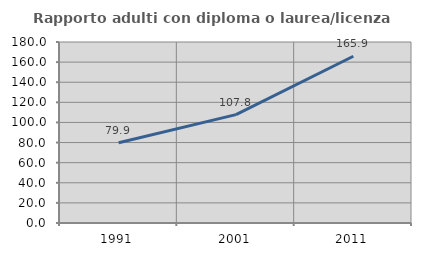
| Category | Rapporto adulti con diploma o laurea/licenza media  |
|---|---|
| 1991.0 | 79.887 |
| 2001.0 | 107.807 |
| 2011.0 | 165.856 |